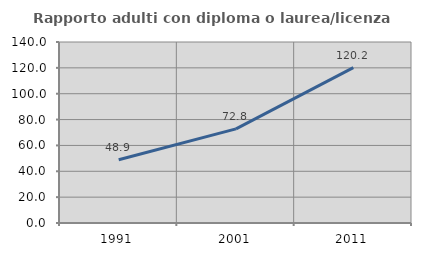
| Category | Rapporto adulti con diploma o laurea/licenza media  |
|---|---|
| 1991.0 | 48.936 |
| 2001.0 | 72.816 |
| 2011.0 | 120.225 |